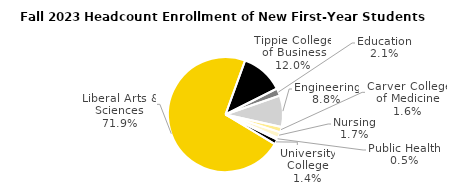
| Category | Series 0 |
|---|---|
| Liberal Arts & Sciences | 3643 |
| Tippie College of Business | 608 |
| Education | 107 |
| Engineering | 446 |
| Carver College of Medicine | 78 |
| Nursing | 85 |
| Public Health | 25 |
| University College | 72 |